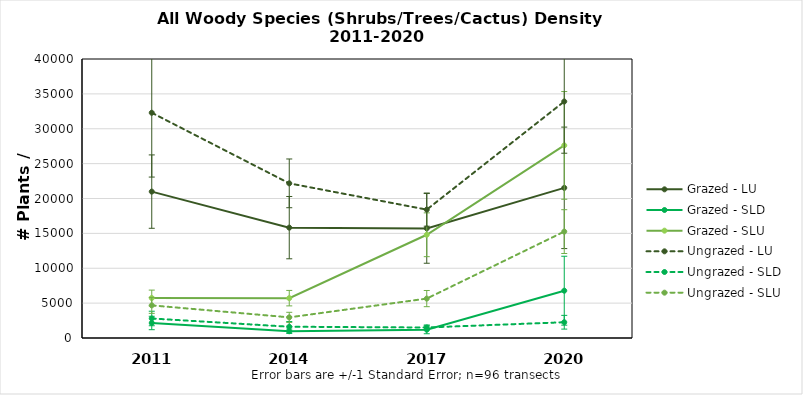
| Category | Grazed - LU | Grazed - SLD | Grazed - SLU | Ungrazed - LU | Ungrazed - SLD | Ungrazed - SLU |
|---|---|---|---|---|---|---|
| 2011.0 | 20989.605 | 2152.78 | 5733.847 | 32291.7 | 2798.614 | 4678.157 |
| 2014.0 | 15822.933 | 968.751 | 5713.147 | 22173.634 | 1614.585 | 2960.072 |
| 2017.0 | 15715.294 | 1184.029 | 14800.363 | 18406.269 | 1506.946 | 5651.048 |
| 2020.0 | 21527.8 | 6781.257 | 27613.543 | 33906.285 | 2260.419 | 15255.758 |